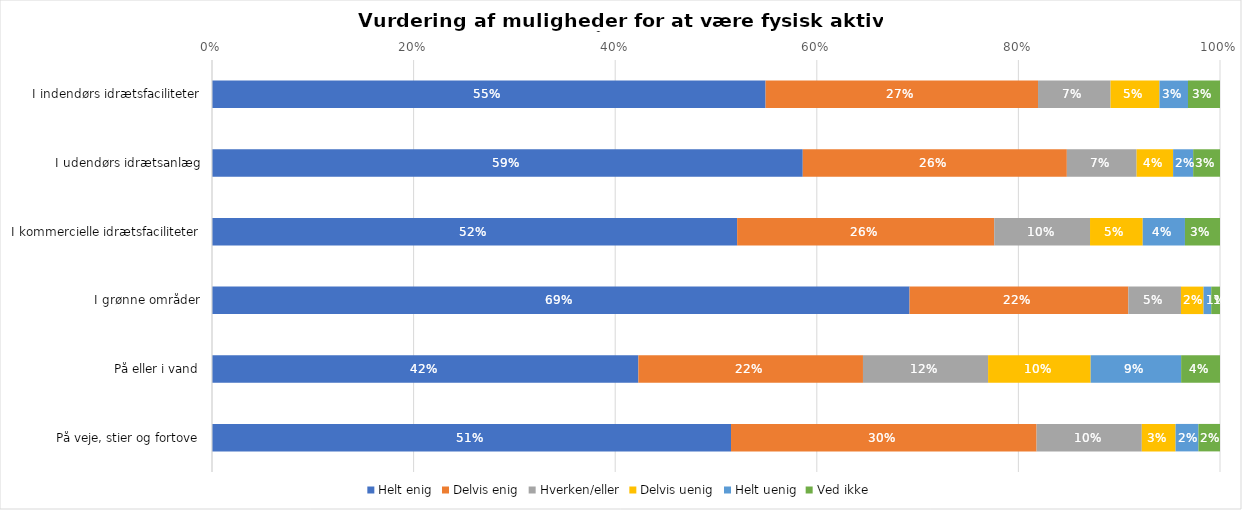
| Category | Helt enig | Delvis enig | Hverken/eller | Delvis uenig | Helt uenig | Ved ikke |
|---|---|---|---|---|---|---|
| I indendørs idrætsfaciliteter | 0.549 | 0.27 | 0.072 | 0.049 | 0.028 | 0.032 |
| I udendørs idrætsanlæg | 0.586 | 0.262 | 0.069 | 0.036 | 0.02 | 0.027 |
| I kommercielle idrætsfaciliteter | 0.521 | 0.255 | 0.095 | 0.052 | 0.042 | 0.035 |
| I grønne områder | 0.692 | 0.217 | 0.052 | 0.022 | 0.008 | 0.009 |
| På eller i vand | 0.423 | 0.223 | 0.124 | 0.102 | 0.09 | 0.039 |
| På veje, stier og fortove | 0.515 | 0.303 | 0.104 | 0.033 | 0.023 | 0.021 |